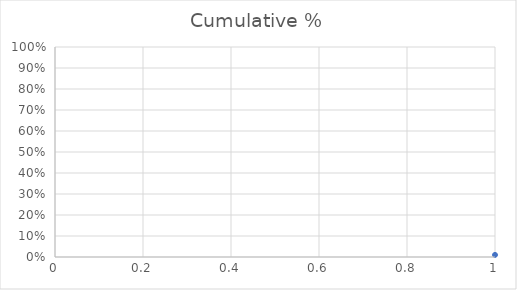
| Category | Cumulative % |
|---|---|
| 0 | 0.01 |
| 1 | 0.03 |
| 2 | 0.15 |
| 3 | 0.39 |
| 4 | 0.68 |
| 5 | 0.83 |
| 6 | 0.93 |
| 7 | 1 |